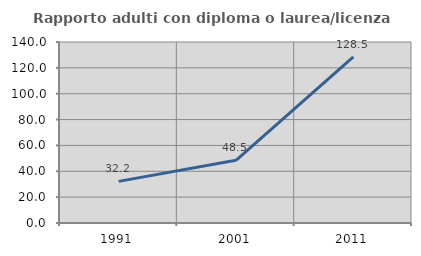
| Category | Rapporto adulti con diploma o laurea/licenza media  |
|---|---|
| 1991.0 | 32.192 |
| 2001.0 | 48.533 |
| 2011.0 | 128.466 |